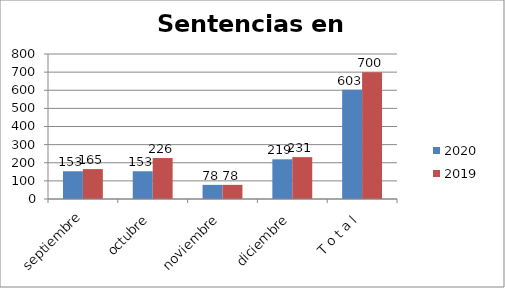
| Category | 2020 | 2019 |
|---|---|---|
| septiembre | 153 | 165 |
| octubre | 153 | 226 |
| noviembre | 78 | 78 |
| diciembre | 219 | 231 |
| T o t a l | 603 | 700 |